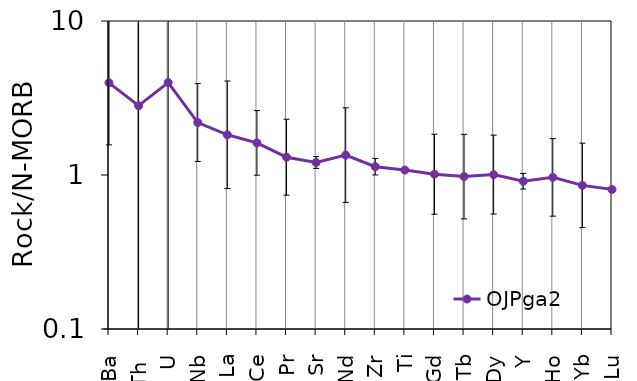
| Category | OJPga2 |
|---|---|
| Ba | 3.967 |
| Th  | 2.817 |
| U | 3.983 |
| Nb | 2.191 |
| La | 1.824 |
| Ce | 1.616 |
| Pr | 1.305 |
| Sr | 1.206 |
| Nd | 1.346 |
| Zr | 1.132 |
| Ti | 1.077 |
| Gd | 1.011 |
| Tb | 0.976 |
| Dy | 1.006 |
| Y | 0.911 |
| Ho | 0.965 |
| Yb | 0.856 |
| Lu | 0.805 |